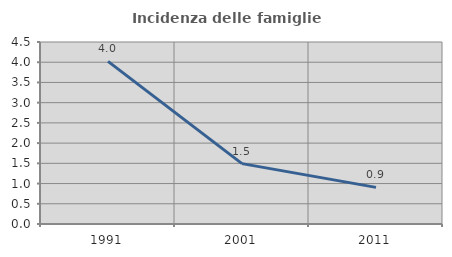
| Category | Incidenza delle famiglie numerose |
|---|---|
| 1991.0 | 4.02 |
| 2001.0 | 1.493 |
| 2011.0 | 0.905 |